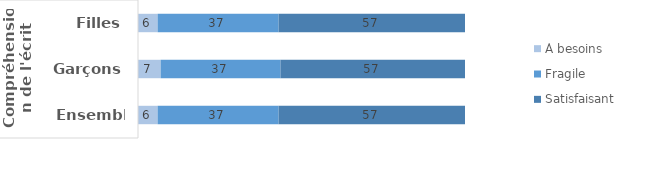
| Category | À besoins | Fragile | Satisfaisant |
|---|---|---|---|
| 0 | 6 | 37 | 57 |
| 1 | 7 | 37 | 57 |
| 2 | 6 | 37 | 57 |